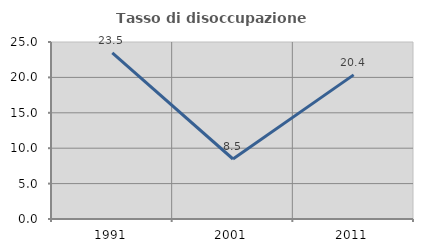
| Category | Tasso di disoccupazione giovanile  |
|---|---|
| 1991.0 | 23.469 |
| 2001.0 | 8.475 |
| 2011.0 | 20.359 |